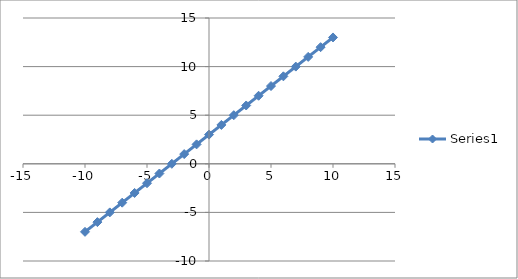
| Category | Series 0 |
|---|---|
| -10.0 | -7 |
| -9.0 | -6 |
| -8.0 | -5 |
| -7.0 | -4 |
| -6.0 | -3 |
| -5.0 | -2 |
| -4.0 | -1 |
| -3.0 | 0 |
| -2.0 | 1 |
| -1.0 | 2 |
| 0.0 | 3 |
| 1.0 | 4 |
| 2.0 | 5 |
| 3.0 | 6 |
| 4.0 | 7 |
| 5.0 | 8 |
| 6.0 | 9 |
| 7.0 | 10 |
| 8.0 | 11 |
| 9.0 | 12 |
| 10.0 | 13 |